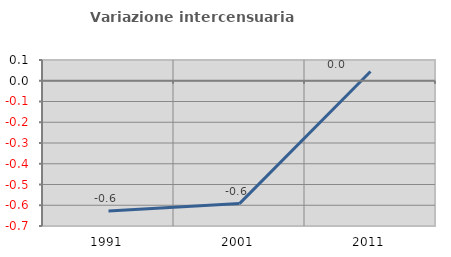
| Category | Variazione intercensuaria annua |
|---|---|
| 1991.0 | -0.628 |
| 2001.0 | -0.592 |
| 2011.0 | 0.044 |